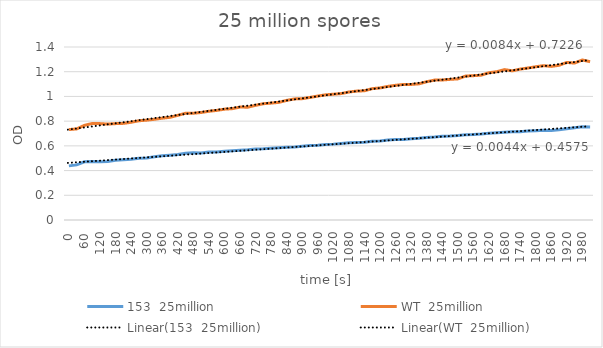
| Category | 153  25million | WT  25million |
|---|---|---|
| 0.0 | 0.438 | 0.732 |
| 30.0 | 0.446 | 0.737 |
| 60.0 | 0.471 | 0.766 |
| 90.0 | 0.474 | 0.781 |
| 120.0 | 0.472 | 0.78 |
| 150.0 | 0.474 | 0.776 |
| 180.0 | 0.483 | 0.78 |
| 210.0 | 0.487 | 0.782 |
| 240.0 | 0.491 | 0.791 |
| 270.0 | 0.5 | 0.803 |
| 300.0 | 0.502 | 0.808 |
| 330.0 | 0.512 | 0.815 |
| 360.0 | 0.519 | 0.824 |
| 390.0 | 0.524 | 0.831 |
| 420.0 | 0.53 | 0.847 |
| 450.0 | 0.54 | 0.864 |
| 480.0 | 0.544 | 0.864 |
| 510.0 | 0.543 | 0.87 |
| 540.0 | 0.55 | 0.88 |
| 570.0 | 0.55 | 0.887 |
| 600.0 | 0.556 | 0.897 |
| 630.0 | 0.56 | 0.901 |
| 660.0 | 0.564 | 0.914 |
| 690.0 | 0.568 | 0.913 |
| 720.0 | 0.575 | 0.928 |
| 750.0 | 0.576 | 0.941 |
| 780.0 | 0.58 | 0.946 |
| 810.0 | 0.584 | 0.952 |
| 840.0 | 0.588 | 0.968 |
| 870.0 | 0.591 | 0.98 |
| 900.0 | 0.596 | 0.982 |
| 930.0 | 0.602 | 0.992 |
| 960.0 | 0.605 | 1.003 |
| 990.0 | 0.611 | 1.013 |
| 1020.0 | 0.614 | 1.018 |
| 1050.0 | 0.619 | 1.023 |
| 1080.0 | 0.625 | 1.036 |
| 1110.0 | 0.627 | 1.043 |
| 1140.0 | 0.629 | 1.046 |
| 1170.0 | 0.638 | 1.063 |
| 1200.0 | 0.639 | 1.069 |
| 1230.0 | 0.647 | 1.081 |
| 1260.0 | 0.651 | 1.09 |
| 1290.0 | 0.652 | 1.097 |
| 1320.0 | 0.657 | 1.097 |
| 1350.0 | 0.661 | 1.102 |
| 1380.0 | 0.668 | 1.119 |
| 1410.0 | 0.672 | 1.132 |
| 1440.0 | 0.678 | 1.133 |
| 1470.0 | 0.68 | 1.138 |
| 1500.0 | 0.684 | 1.142 |
| 1530.0 | 0.69 | 1.165 |
| 1560.0 | 0.692 | 1.168 |
| 1590.0 | 0.696 | 1.172 |
| 1620.0 | 0.702 | 1.192 |
| 1650.0 | 0.706 | 1.2 |
| 1680.0 | 0.711 | 1.217 |
| 1710.0 | 0.714 | 1.207 |
| 1740.0 | 0.715 | 1.221 |
| 1770.0 | 0.72 | 1.23 |
| 1800.0 | 0.723 | 1.24 |
| 1830.0 | 0.727 | 1.249 |
| 1860.0 | 0.725 | 1.243 |
| 1890.0 | 0.731 | 1.252 |
| 1920.0 | 0.739 | 1.275 |
| 1950.0 | 0.746 | 1.27 |
| 1980.0 | 0.754 | 1.295 |
| 2010.0 | 0.753 | 1.281 |